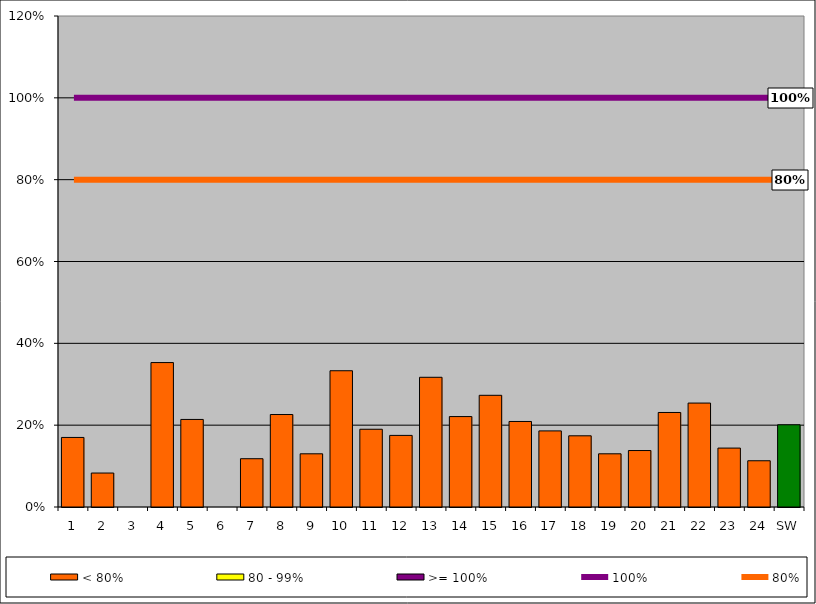
| Category | < 80% | 80 - 99% | >= 100% |
|---|---|---|---|
| 1 | 0.17 | 0 | 0 |
| 2 | 0.083 | 0 | 0 |
| 3 | 0 | 0 | 0 |
| 4 | 0.353 | 0 | 0 |
| 5 | 0.214 | 0 | 0 |
| 6 | 0 | 0 | 0 |
| 7 | 0.118 | 0 | 0 |
| 8 | 0.226 | 0 | 0 |
| 9 | 0.13 | 0 | 0 |
| 10 | 0.333 | 0 | 0 |
| 11 | 0.19 | 0 | 0 |
| 12 | 0.175 | 0 | 0 |
| 13 | 0.317 | 0 | 0 |
| 14 | 0.221 | 0 | 0 |
| 15 | 0.273 | 0 | 0 |
| 16 | 0.209 | 0 | 0 |
| 17 | 0.186 | 0 | 0 |
| 18 | 0.174 | 0 | 0 |
| 19 | 0.13 | 0 | 0 |
| 20 | 0.138 | 0 | 0 |
| 21 | 0.231 | 0 | 0 |
| 22 | 0.254 | 0 | 0 |
| 23 | 0.144 | 0 | 0 |
| 24 | 0.113 | 0 | 0 |
| SW | 0.201 | 0 | 0 |